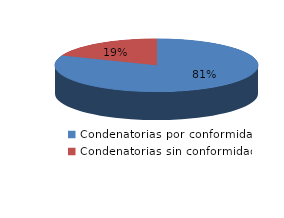
| Category | Series 0 |
|---|---|
| 0 | 1646 |
| 1 | 384 |